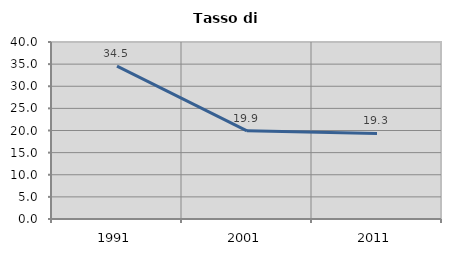
| Category | Tasso di disoccupazione   |
|---|---|
| 1991.0 | 34.549 |
| 2001.0 | 19.934 |
| 2011.0 | 19.323 |